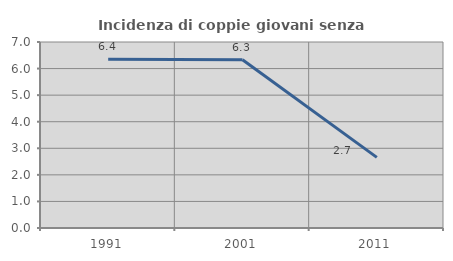
| Category | Incidenza di coppie giovani senza figli |
|---|---|
| 1991.0 | 6.353 |
| 2001.0 | 6.335 |
| 2011.0 | 2.658 |